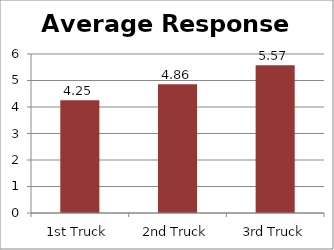
| Category | Average Response Time |
|---|---|
| 1st Truck | 4.254 |
| 2nd Truck | 4.859 |
| 3rd Truck | 5.571 |